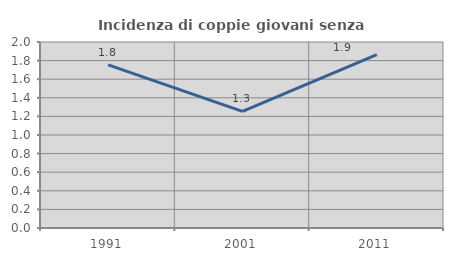
| Category | Incidenza di coppie giovani senza figli |
|---|---|
| 1991.0 | 1.754 |
| 2001.0 | 1.254 |
| 2011.0 | 1.863 |